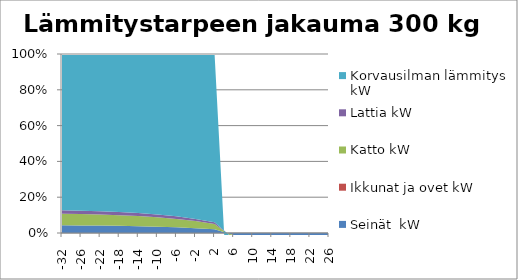
| Category | Seinät  kW | Ikkunat ja ovet kW | Katto kW | Lattia kW | Korvausilman lämmitys kW |
|---|---|---|---|---|---|
| -32.0 | 7.392 | 0 | 10.92 | 3.276 | 147.903 |
| -26.0 | 6.125 | 0 | 9.048 | 2.714 | 125.966 |
| -22.0 | 5.28 | 0 | 7.8 | 2.34 | 111.704 |
| -18.0 | 4.435 | 0 | 6.552 | 1.966 | 97.666 |
| -14.0 | 3.59 | 0 | 5.304 | 1.591 | 83.692 |
| -10.0 | 2.746 | 0 | 4.056 | 1.217 | 69.444 |
| -6.0 | 1.901 | 0 | 2.808 | 0.842 | 54.182 |
| -2.0 | 1.056 | 0 | 1.56 | 0.468 | 36.119 |
| 2.0 | 0.211 | 0 | 0.312 | 0.094 | 9.759 |
| 6.0 | -0.634 | 0 | -0.936 | -0.281 | -53.405 |
| 10.0 | -1.478 | 0 | -2.184 | -0.655 | -20.885 |
| 14.0 | -2.323 | 0 | -3.432 | -1.03 | -32.819 |
| 18.0 | -3.168 | 0 | -4.68 | -1.404 | -44.754 |
| 22.0 | -4.013 | 0 | -5.928 | -1.778 | -56.688 |
| 26.0 | -4.858 | 0 | -7.176 | -2.153 | -68.622 |